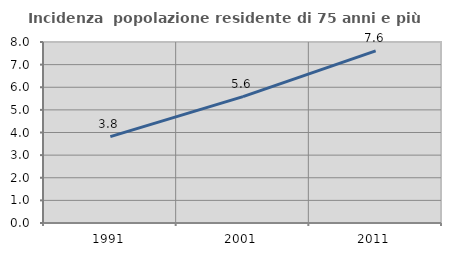
| Category | Incidenza  popolazione residente di 75 anni e più |
|---|---|
| 1991.0 | 3.817 |
| 2001.0 | 5.585 |
| 2011.0 | 7.606 |